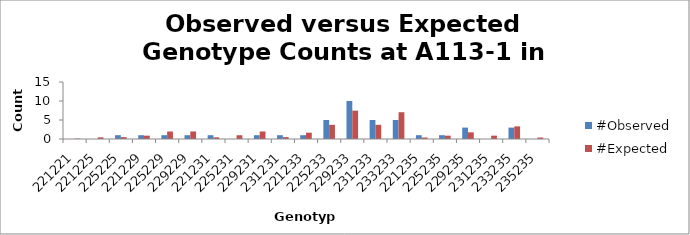
| Category | #Observed | #Expected |
|---|---|---|
| 221221.0 | 0 | 0.098 |
| 221225.0 | 0 | 0.439 |
| 225225.0 | 1 | 0.494 |
| 221229.0 | 1 | 0.878 |
| 225229.0 | 1 | 1.976 |
| 229229.0 | 1 | 1.976 |
| 221231.0 | 1 | 0.439 |
| 225231.0 | 0 | 0.988 |
| 229231.0 | 1 | 1.976 |
| 231231.0 | 1 | 0.494 |
| 221233.0 | 1 | 1.659 |
| 225233.0 | 5 | 3.732 |
| 229233.0 | 10 | 7.463 |
| 231233.0 | 5 | 3.732 |
| 233233.0 | 5 | 7.049 |
| 221235.0 | 1 | 0.39 |
| 225235.0 | 1 | 0.878 |
| 229235.0 | 3 | 1.756 |
| 231235.0 | 0 | 0.878 |
| 233235.0 | 3 | 3.317 |
| 235235.0 | 0 | 0.39 |